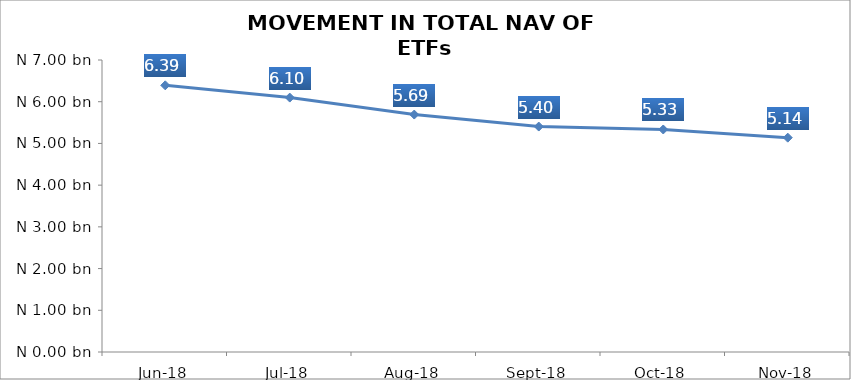
| Category | Series 0 |
|---|---|
| 2018-06-01 | 6392823777.55 |
| 2018-07-01 | 6098924594.48 |
| 2018-08-01 | 5692304392.97 |
| 2018-09-01 | 5404681331.97 |
| 2018-10-01 | 5333989892.62 |
| 2018-11-01 | 5138140059.08 |